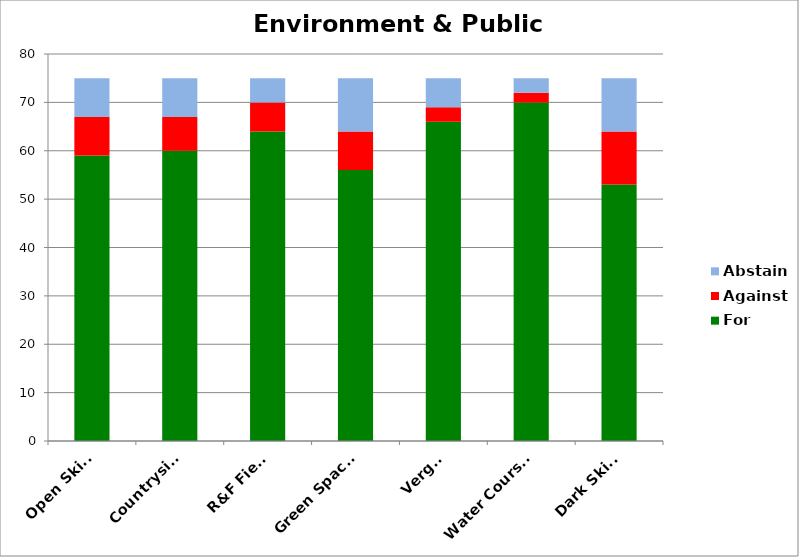
| Category | For | Against | Abstain |
|---|---|---|---|
| Open Skies | 59 | 8 | 8 |
| Countryside | 60 | 7 | 8 |
| R&F Field | 64 | 6 | 5 |
| Green Spaces | 56 | 8 | 11 |
| Verges | 66 | 3 | 6 |
| Water Courses | 70 | 2 | 3 |
| Dark Skies | 53 | 11 | 11 |